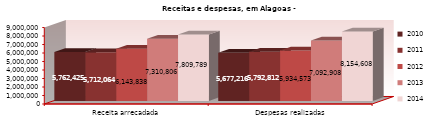
| Category | 2010 | 2011 | 2012 | 2013 | 2014 |
|---|---|---|---|---|---|
| Receita arrecadada | 5762425 | 5712064 | 6143838 | 7310806 | 7809789 |
| Despesas realizadas | 5677216 | 5792812 | 5934573 | 7092908 | 8154608 |